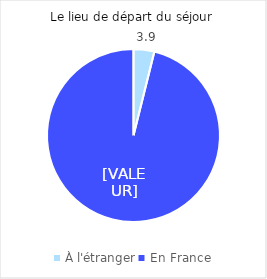
| Category | Series 0 |
|---|---|
| À l'étranger | 3.883 |
| En France | 96.117 |